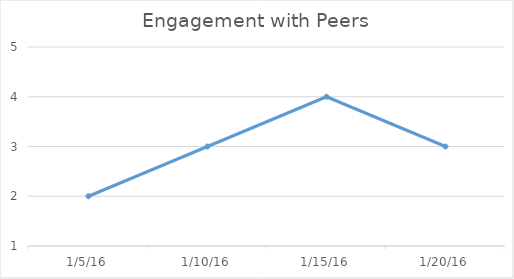
| Category | Series 0 |
|---|---|
| 1/5/16 | 2 |
| 1/10/16 | 3 |
| 1/15/16 | 4 |
| 1/20/16 | 3 |